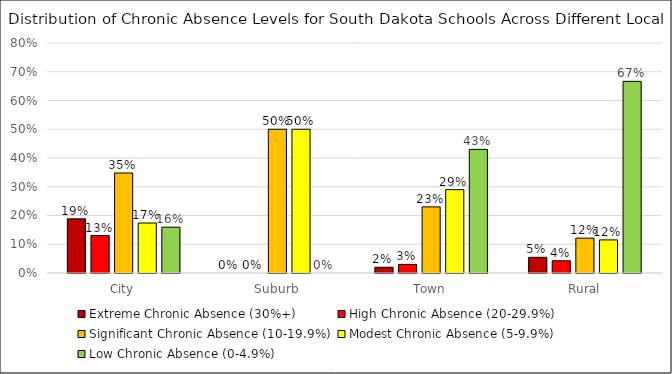
| Category | Extreme Chronic Absence (30%+) | High Chronic Absence (20-29.9%) | Significant Chronic Absence (10-19.9%) | Modest Chronic Absence (5-9.9%) | Low Chronic Absence (0-4.9%) |
|---|---|---|---|---|---|
| City | 0.188 | 0.13 | 0.348 | 0.174 | 0.159 |
| Suburb | 0 | 0 | 0.5 | 0.5 | 0 |
| Town | 0.02 | 0.03 | 0.23 | 0.29 | 0.43 |
| Rural | 0.055 | 0.042 | 0.121 | 0.115 | 0.667 |